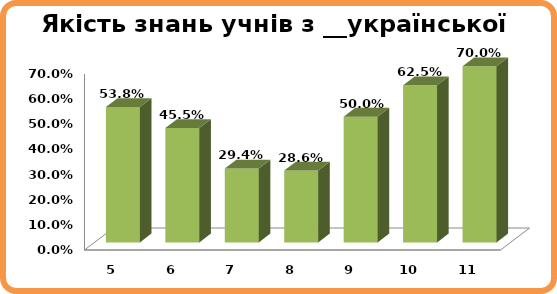
| Category | Series 0 |
|---|---|
| 5.0 | 0.538 |
| 6.0 | 0.455 |
| 7.0 | 0.294 |
| 8.0 | 0.286 |
| 9.0 | 0.5 |
| 10.0 | 0.625 |
| 11.0 | 0.7 |